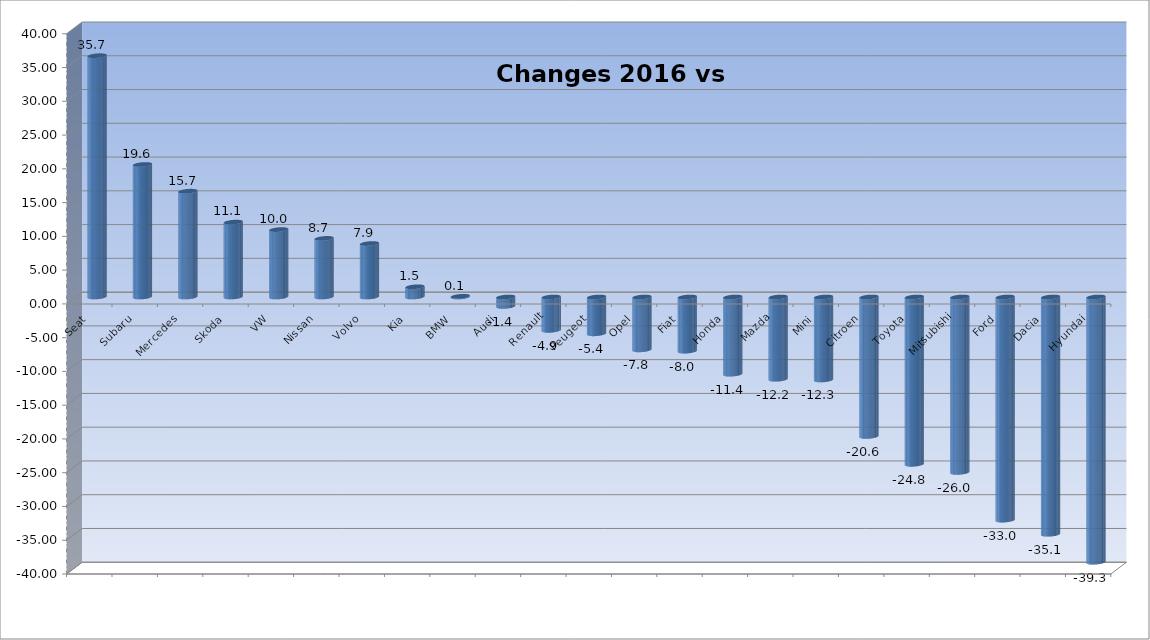
| Category | Ytd 2015 |
|---|---|
| Seat | 35.731 |
| Subaru | 19.622 |
| Mercedes | 15.668 |
| Skoda | 11.089 |
| VW | 9.982 |
| Nissan | 8.679 |
| Volvo | 7.916 |
| Kia | 1.514 |
| BMW | 0.107 |
| Audi | -1.396 |
| Renault | -4.941 |
| Peugeot | -5.449 |
| Opel | -7.826 |
| Fiat | -8.019 |
| Honda | -11.429 |
| Mazda | -12.182 |
| Mini | -12.287 |
| Citroen | -20.65 |
| Toyota | -24.778 |
| Mitsubishi | -25.979 |
| Ford | -33.045 |
| Dacia | -35.135 |
| Hyundai | -39.283 |